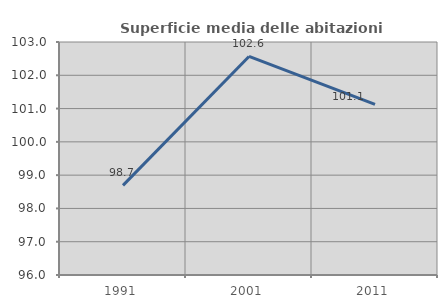
| Category | Superficie media delle abitazioni occupate |
|---|---|
| 1991.0 | 98.693 |
| 2001.0 | 102.566 |
| 2011.0 | 101.125 |